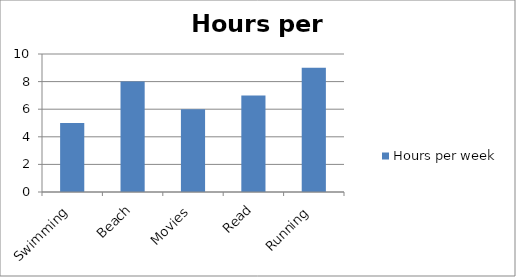
| Category | Hours per week |
|---|---|
| Swimming | 5 |
| Beach | 8 |
| Movies | 6 |
| Read | 7 |
| Running | 9 |